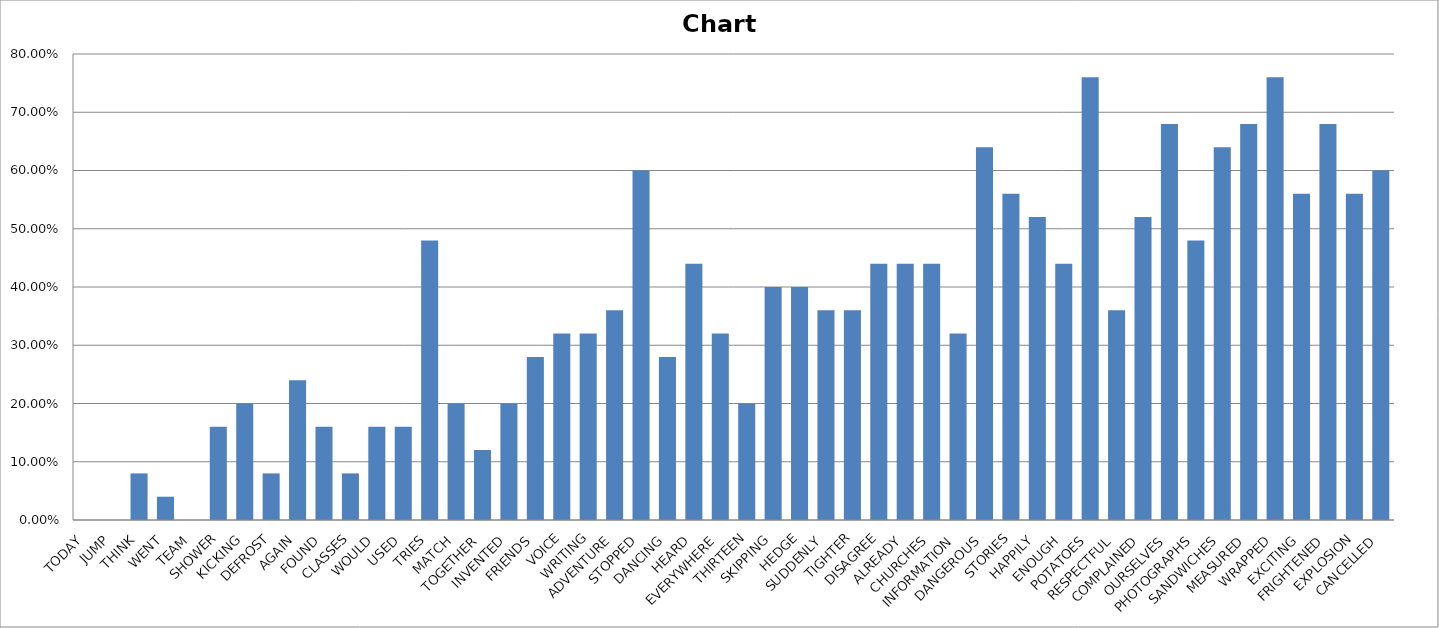
| Category | Series 0 |
|---|---|
| TODAY | 0 |
| JUMP | 0 |
| THINK | 0.08 |
| WENT | 0.04 |
| TEAM | 0 |
| SHOWER | 0.16 |
| KICKING | 0.2 |
| DEFROST | 0.08 |
| AGAIN | 0.24 |
| FOUND | 0.16 |
| CLASSES | 0.08 |
| WOULD | 0.16 |
| USED | 0.16 |
| TRIES | 0.48 |
| MATCH | 0.2 |
| TOGETHER | 0.12 |
| INVENTED | 0.2 |
| FRIENDS | 0.28 |
| VOICE | 0.32 |
| WRITING | 0.32 |
| ADVENTURE | 0.36 |
| STOPPED | 0.6 |
| DANCING | 0.28 |
| HEARD | 0.44 |
| EVERYWHERE | 0.32 |
| THIRTEEN | 0.2 |
| SKIPPING | 0.4 |
| HEDGE | 0.4 |
| SUDDENLY | 0.36 |
| TIGHTER | 0.36 |
| DISAGREE | 0.44 |
| ALREADY | 0.44 |
| CHURCHES | 0.44 |
| INFORMATION | 0.32 |
| DANGEROUS | 0.64 |
| STORIES | 0.56 |
| HAPPILY | 0.52 |
| ENOUGH | 0.44 |
| POTATOES | 0.76 |
| RESPECTFUL | 0.36 |
| COMPLAINED | 0.52 |
| OURSELVES | 0.68 |
| PHOTOGRAPHS | 0.48 |
| SANDWICHES | 0.64 |
| MEASURED | 0.68 |
| WRAPPED | 0.76 |
| EXCITING | 0.56 |
| FRIGHTENED | 0.68 |
| EXPLOSION | 0.56 |
| CANCELLED | 0.6 |